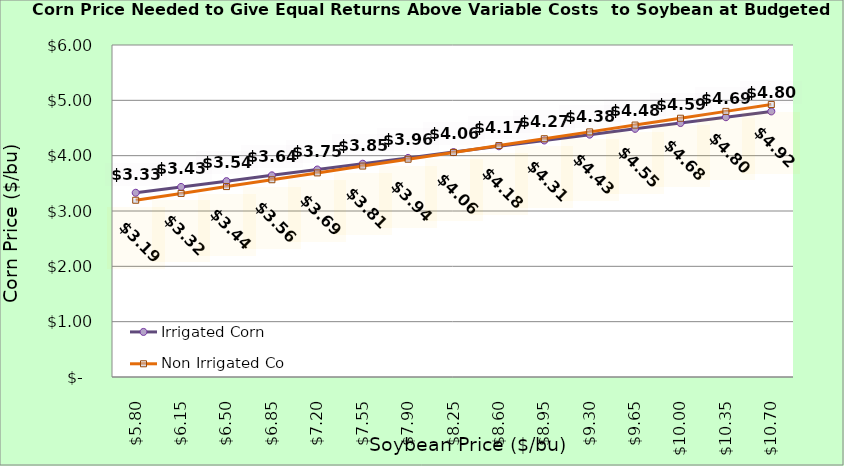
| Category | Irrigated Corn | Non Irrigated Corn |
|---|---|---|
| 5.8000000000000025 | 3.33 | 3.194 |
| 6.150000000000002 | 3.435 | 3.318 |
| 6.500000000000002 | 3.54 | 3.441 |
| 6.850000000000001 | 3.645 | 3.565 |
| 7.200000000000001 | 3.75 | 3.688 |
| 7.550000000000001 | 3.855 | 3.812 |
| 7.9 | 3.96 | 3.936 |
| 8.25 | 4.065 | 4.059 |
| 8.6 | 4.17 | 4.183 |
| 8.95 | 4.275 | 4.306 |
| 9.299999999999999 | 4.38 | 4.43 |
| 9.649999999999999 | 4.485 | 4.553 |
| 9.999999999999998 | 4.59 | 4.677 |
| 10.349999999999998 | 4.695 | 4.8 |
| 10.699999999999998 | 4.8 | 4.924 |